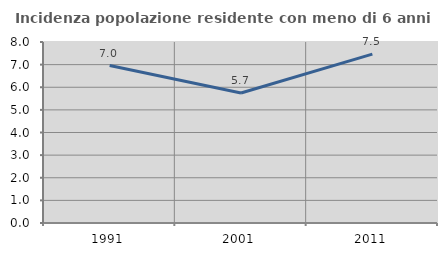
| Category | Incidenza popolazione residente con meno di 6 anni |
|---|---|
| 1991.0 | 6.961 |
| 2001.0 | 5.744 |
| 2011.0 | 7.462 |